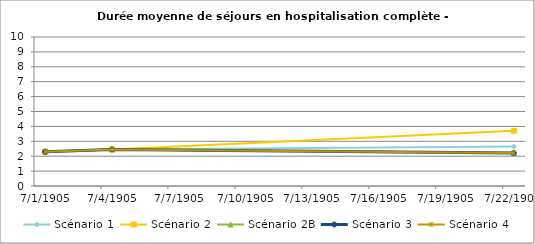
| Category | Scénario 1 | Scénario 2 | Scénario 2B | Scénario 3 | Scénario 4 |
|---|---|---|---|---|---|
| 2009.0 | 2.302 | 2.302 | 2.302 | 2.302 | 2.302 |
| 2012.0 | 2.457 | 2.457 | 2.457 | 2.457 | 2.457 |
| 2030.0 | 2.645 | 3.7 | 2.211 | 2.211 | 2.211 |